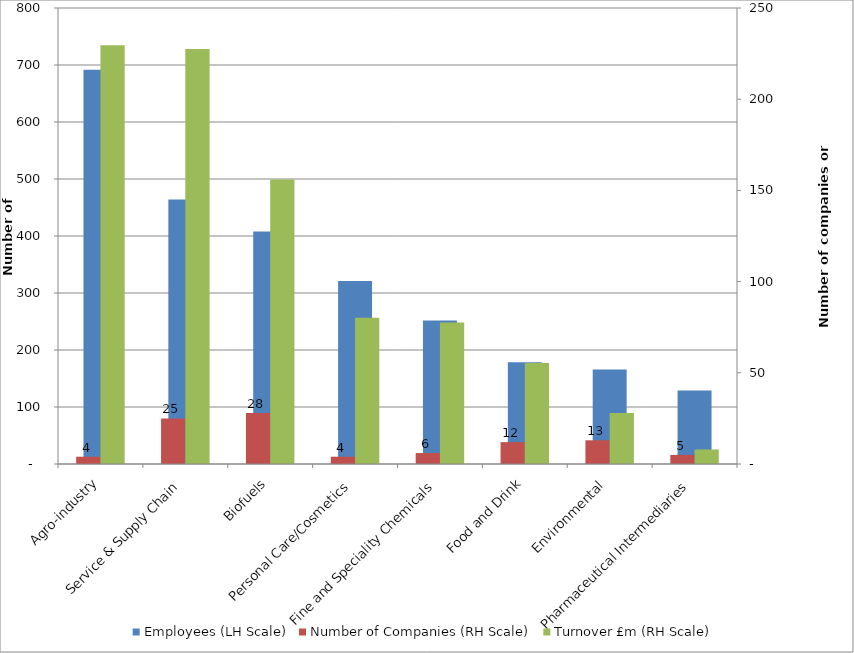
| Category | Employees (LH Scale) |
|---|---|
| Agro-industry | 691.5 |
| Service & Supply Chain | 463.9 |
| Biofuels | 407.92 |
| Personal Care/Cosmetics | 321 |
| Fine and Speciality Chemicals | 251.75 |
| Food and Drink | 178.35 |
| Environmental | 165.6 |
| Pharmaceutical Intermediaries | 129 |